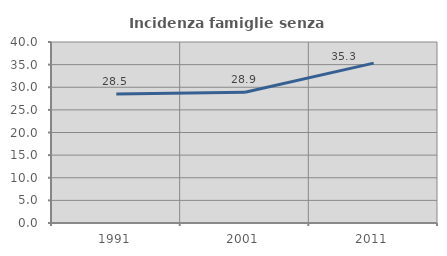
| Category | Incidenza famiglie senza nuclei |
|---|---|
| 1991.0 | 28.502 |
| 2001.0 | 28.899 |
| 2011.0 | 35.338 |